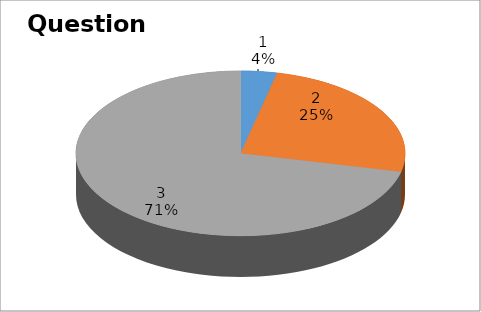
| Category | Series 0 |
|---|---|
| 0 | 1 |
| 1 | 7 |
| 2 | 20 |